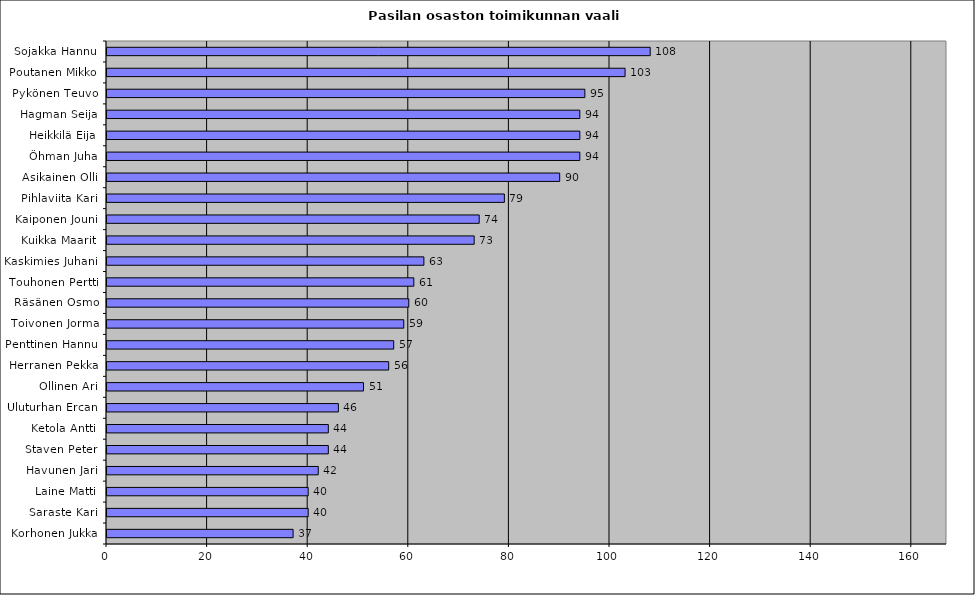
| Category | Series 0 |
|---|---|
| Sojakka Hannu | 108 |
| Poutanen Mikko | 103 |
| Pykönen Teuvo | 95 |
| Hagman Seija | 94 |
| Heikkilä Eija | 94 |
| Öhman Juha | 94 |
| Asikainen Olli | 90 |
| Pihlaviita Kari | 79 |
| Kaiponen Jouni | 74 |
| Kuikka Maarit | 73 |
| Kaskimies Juhani | 63 |
| Touhonen Pertti | 61 |
| Räsänen Osmo | 60 |
| Toivonen Jorma | 59 |
| Penttinen Hannu | 57 |
| Herranen Pekka | 56 |
| Ollinen Ari | 51 |
| Uluturhan Ercan | 46 |
| Ketola Antti | 44 |
| Staven Peter | 44 |
| Havunen Jari | 42 |
| Laine Matti | 40 |
| Saraste Kari | 40 |
| Korhonen Jukka | 37 |